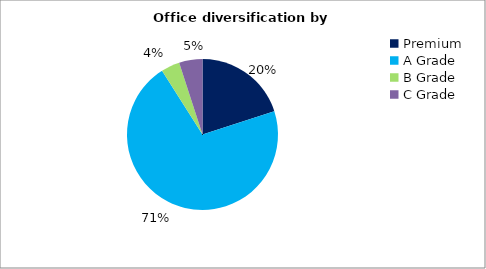
| Category | Series 0 |
|---|---|
| Premium | 0.2 |
| A Grade | 0.71 |
| B Grade | 0.04 |
| C Grade | 0.05 |